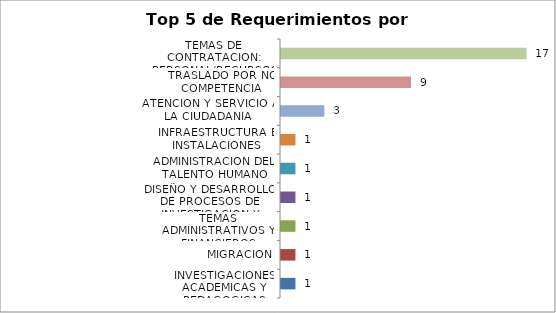
| Category | Total |
|---|---|
| INVESTIGACIONES ACADEMICAS Y PEDAGOGICAS | 1 |
| MIGRACION | 1 |
| TEMAS ADMINISTRATIVOS Y FINANCIEROS | 1 |
| DISEÑO Y DESARROLLO DE PROCESOS DE INVESTIGACION Y FORMACION | 1 |
| ADMINISTRACION DEL TALENTO HUMANO | 1 |
| INFRAESTRUCTURA E INSTALACIONES | 1 |
| ATENCION Y SERVICIO A LA CIUDADANIA | 3 |
| TRASLADO POR NO COMPETENCIA | 9 |
| TEMAS DE CONTRATACION: PERSONAL/RECURSOS FISICOS | 17 |